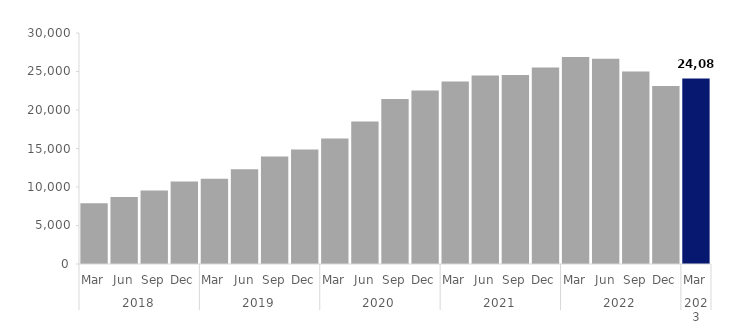
| Category | Series 0 |
|---|---|
| 0 | 7890 |
| 1 | 8703 |
| 2 | 9537 |
| 3 | 10713 |
| 4 | 11067 |
| 5 | 12309 |
| 6 | 13965 |
| 7 | 14868 |
| 8 | 16308 |
| 9 | 18522 |
| 10 | 21414 |
| 11 | 22521 |
| 12 | 23688 |
| 13 | 24474 |
| 14 | 24546 |
| 15 | 25524 |
| 16 | 26868 |
| 17 | 26664 |
| 18 | 24996 |
| 19 | 23127 |
| 20 | 24081 |